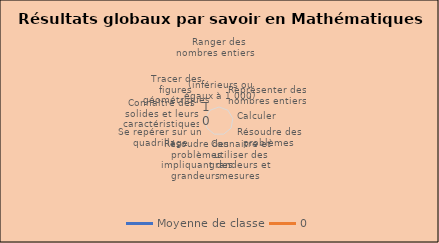
| Category | Moyenne de classe | 0 |
|---|---|---|
| Ranger des nombres entiers                                                 (inférieurs ou égaux à 1 000) | 0 |  |
| Représenter des nombres entiers | 0 |  |
| Calculer  | 0 |  |
| Résoudre des problèmes  | 0 |  |
| Connaitre et utiliser des grandeurs et mesures | 0 |  |
| Résoudre des problèmes impliquant des grandeurs  | 0 |  |
| Se repérer sur un quadrillage | 0 |  |
| Connaître des solides et leurs caractéristiques | 0 |  |
| Tracer des figures géométriques | 0 |  |